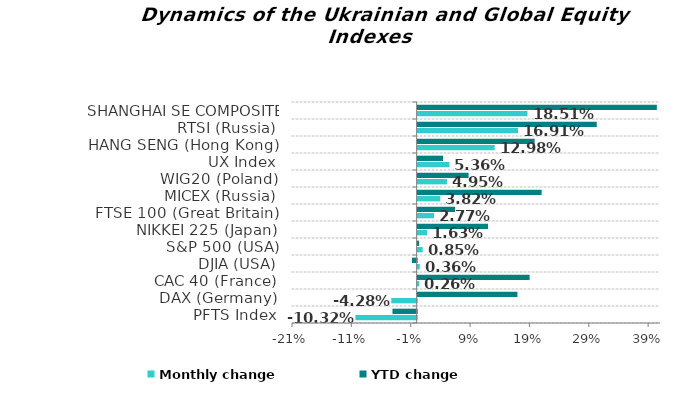
| Category | Monthly change | YTD change |
|---|---|---|
| PFTS Index | -0.103 | -0.041 |
| DAX (Germany) | -0.043 | 0.168 |
| CAC 40 (France) | 0.003 | 0.189 |
| DJIA (USA) | 0.004 | -0.008 |
| S&P 500 (USA) | 0.009 | 0.002 |
| NIKKEI 225 (Japan) | 0.016 | 0.119 |
| FTSE 100 (Great Britain) | 0.028 | 0.063 |
| MICEX (Russia) | 0.038 | 0.209 |
| WIG20 (Poland) | 0.05 | 0.086 |
| UX Index | 0.054 | 0.043 |
| HANG SENG (Hong Kong) | 0.13 | 0.197 |
| RTSI (Russia) | 0.169 | 0.302 |
| SHANGHAI SE COMPOSITE (China) | 0.185 | 0.403 |